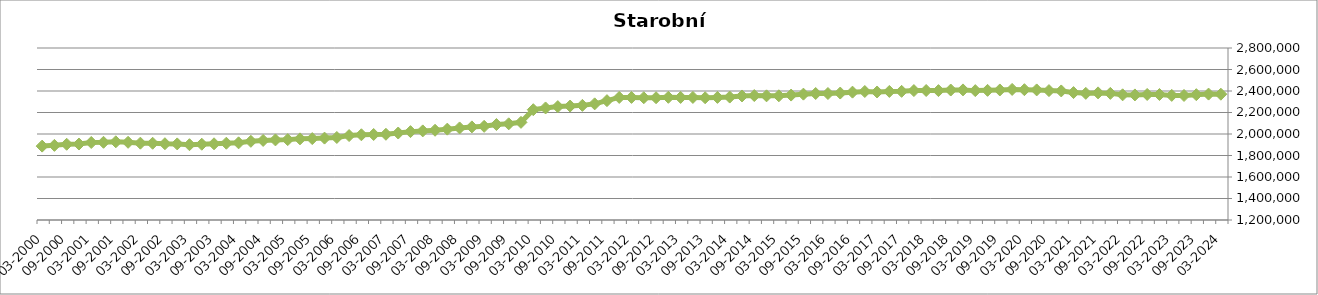
| Category | Starobní důchodci |
|---|---|
| 03-2024 | 2370334 |
| 12-2023 | 2371241 |
| 09-2023 | 2365668 |
| 06-2023 | 2358367 |
| 03-2023 | 2359285 |
| 12-2022 | 2367185 |
| 09-2022 | 2367780 |
| 06-2022 | 2363406 |
| 03-2022 | 2364429 |
| 12-2021 | 2377820 |
| 09-2021 | 2382451 |
| 06-2021 | 2378079 |
| 03-2021 | 2385460 |
| 12-2020 | 2400479 |
| 09-2020 | 2403767 |
| 06-2020 | 2409904 |
| 03-2020 | 2412354 |
| 12-2019 | 2414814 |
| 09-2019 | 2409704 |
| 06-2019 | 2406014 |
| 03-2019 | 2403526 |
| 12-2018 | 2410080 |
| 09-2018 | 2409128 |
| 06-2018 | 2403695 |
| 03-2018 | 2404626 |
| 12-2017 | 2403933 |
| 09-2017 | 2396784 |
| 06-2017 | 2396032 |
| 03-2017 | 2390781 |
| 12-2016 | 2395382 |
| 09-2016 | 2389270 |
| 06-2016 | 2381012 |
| 03-2016 | 2376668 |
| 12-2015 | 2376883 |
| 09-2015 | 2370725 |
| 06-2015 | 2362155 |
| 03-2015 | 2355354 |
| 12-2014 | 2355144 |
| 09-2014 | 2357749 |
| 06-2014 | 2353691 |
| 03-2014 | 2343504 |
| 12-2013 | 2340321 |
| 09-2013 | 2337103 |
| 06-2013 | 2340234 |
| 03-2013 | 2340148 |
| 12-2012 | 2341220 |
| 09-2012 | 2337480 |
| 06-2012 | 2337454 |
| 03-2012 | 2340218 |
| 12-2011 | 2340147 |
| 09-2011 | 2310238 |
| 06-2011 | 2280450 |
| 03-2011 | 2266348 |
| 12-2010 | 2260032 |
| 09-2010 | 2254779 |
| 06-2010 | 2242281 |
| 03-2010 | 2225908 |
| 12-2009 | 2108368 |
| 09-2009 | 2094808 |
| 06-2009 | 2087987 |
| 03-2009 | 2071269 |
| 12-2008 | 2066005 |
| 09-2008 | 2056338 |
| 06-2008 | 2045166 |
| 03-2008 | 2034881 |
| 12-2007 | 2028865 |
| 09-2007 | 2022116 |
| 06-2007 | 2009076 |
| 03-2007 | 1997503 |
| 12-2006 | 1995350 |
| 09-2006 | 1992858 |
| 06-2006 | 1985580 |
| 03-2006 | 1967685 |
| 12-2005 | 1961870 |
| 09-2005 | 1957299 |
| 06-2005 | 1954836 |
| 03-2005 | 1947667 |
| 12-2004 | 1944915 |
| 09-2004 | 1940213 |
| 06-2004 | 1931940 |
| 03-2004 | 1917839 |
| 12-2003 | 1914219 |
| 09-2003 | 1908877 |
| 06-2003 | 1904721 |
| 03-2003 | 1900334 |
| 12-2002 | 1907830 |
| 09-2002 | 1909580 |
| 06-2002 | 1913863 |
| 03-2002 | 1914684 |
| 12-2001 | 1922772 |
| 09-2001 | 1927410 |
| 06-2001 | 1922839 |
| 03-2001 | 1920972 |
| 12-2000 | 1906759 |
| 09-2000 | 1904456 |
| 06-2000 | 1894317 |
| 03-2000 | 1887287 |